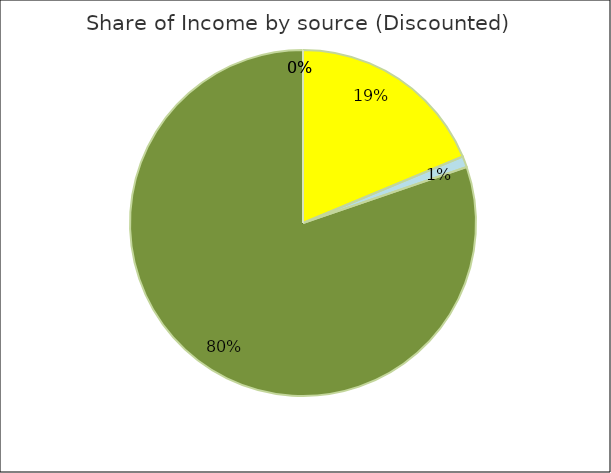
| Category | Series 1 |
|---|---|
| Carbon | 0.187 |
| Grant | 0.01 |
| Timber | 0.802 |
| Donations | 0 |
| Other | 0 |